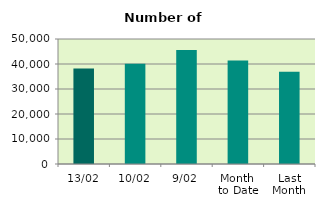
| Category | Series 0 |
|---|---|
| 13/02 | 38208 |
| 10/02 | 40098 |
| 9/02 | 45552 |
| Month 
to Date | 41436.444 |
| Last
Month | 36886.364 |